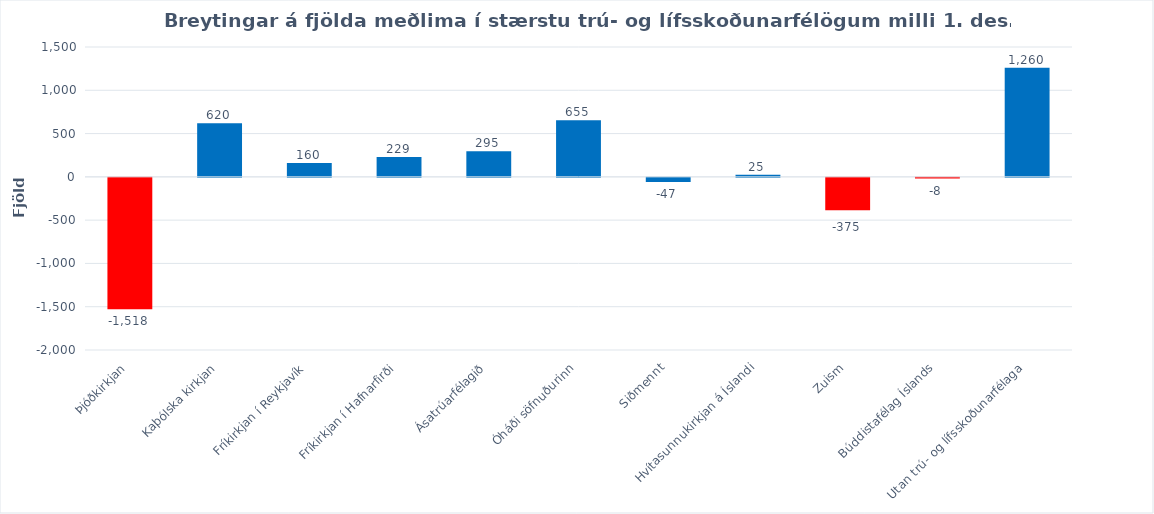
| Category | Series 0 |
|---|---|
| Þjóðkirkjan | -1518 |
| Kaþólska kirkjan | 620 |
| Fríkirkjan í Reykjavík | 160 |
| Fríkirkjan í Hafnarfirði | 229 |
| Ásatrúarfélagið | 295 |
| Óháði söfnuðurinn | 655 |
| Siðmennt | -47 |
| Hvítasunnukirkjan á Íslandi | 25 |
| Zuism | -375 |
| Búddistafélag Íslands | -8 |
| Utan trú- og lífsskoðunarfélaga | 1260 |